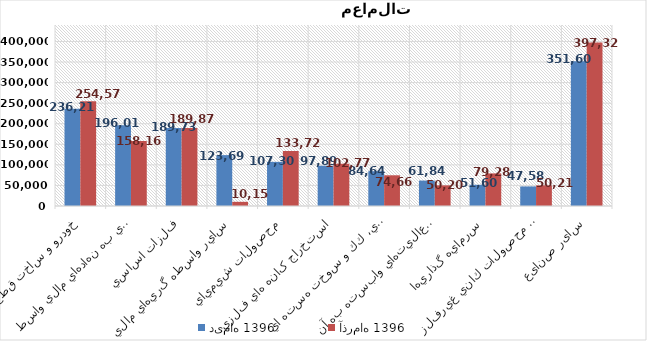
| Category | دی‌ماه 1396 | آذر‌ماه 1396 |
|---|---|---|
| خودرو و ساخت قطعات | 236219 | 254578 |
| فعاليتهاي كمكي به نهادهاي مالي واسط | 196011 | 158167 |
| فلزات اساسي | 189737 | 189870 |
| ساير واسطه گريهاي مالي | 123690 | 10152 |
| محصولات شيميايي | 107301 | 133729 |
| استخراج کانه هاي فلزي | 97896 | 102774 |
| فراورده هاي نفتي، كك و سوخت هسته اي | 84648 | 74663 |
| رايانه و فعاليت‌هاي وابسته به آن | 61847 | 50203 |
| سرمايه گذاريها | 51606 | 79284 |
| ساير محصولات كاني غيرفلزي | 47580 | 50217 |
| سایر صنایع | 351604 | 397328 |